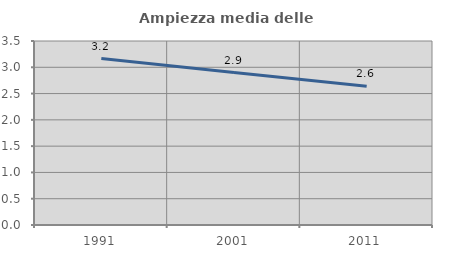
| Category | Ampiezza media delle famiglie |
|---|---|
| 1991.0 | 3.167 |
| 2001.0 | 2.9 |
| 2011.0 | 2.639 |